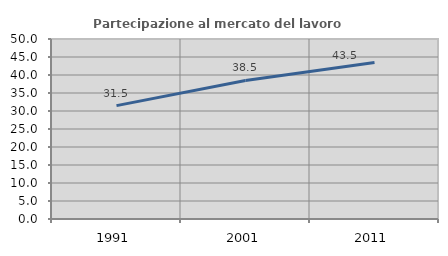
| Category | Partecipazione al mercato del lavoro  femminile |
|---|---|
| 1991.0 | 31.5 |
| 2001.0 | 38.496 |
| 2011.0 | 43.496 |